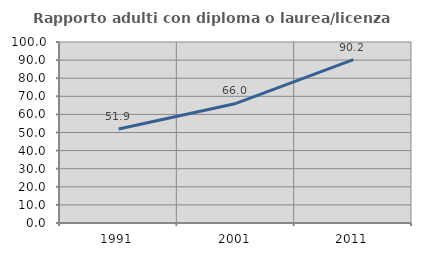
| Category | Rapporto adulti con diploma o laurea/licenza media  |
|---|---|
| 1991.0 | 51.885 |
| 2001.0 | 66.048 |
| 2011.0 | 90.241 |